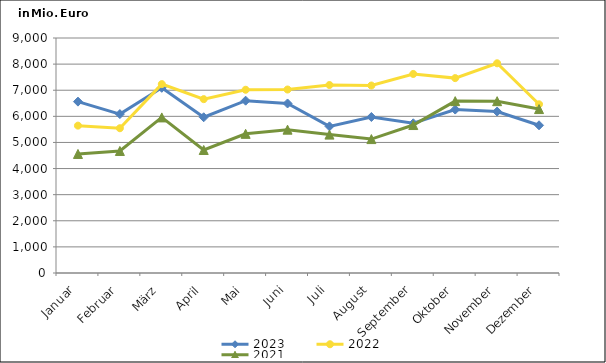
| Category | 2023 | 2022 | 2021 |
|---|---|---|---|
| Januar | 6563.057 | 5643.554 | 4558.706 |
| Februar | 6086.326 | 5544.18 | 4673.66 |
| März | 7092.567 | 7234.556 | 5958.617 |
| April | 5964.382 | 6658.164 | 4711.185 |
| Mai | 6599.641 | 7017.263 | 5329.247 |
| Juni | 6492.142 | 7027.047 | 5489.574 |
| Juli | 5616.254 | 7199.22 | 5299.955 |
| August | 5974.603 | 7180.161 | 5128.51 |
| September | 5733.456 | 7623.248 | 5666.535 |
| Oktober | 6259.15 | 7463.874 | 6582.428 |
| November | 6183.416 | 8031.762 | 6580.115 |
| Dezember | 5656.764 | 6461.139 | 6277.924 |